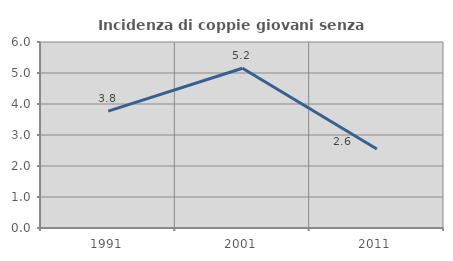
| Category | Incidenza di coppie giovani senza figli |
|---|---|
| 1991.0 | 3.771 |
| 2001.0 | 5.152 |
| 2011.0 | 2.55 |